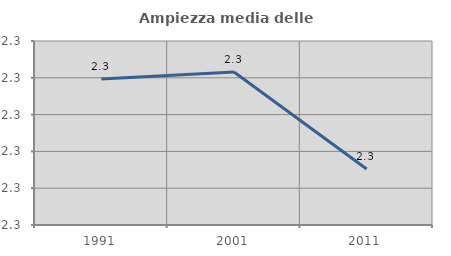
| Category | Ampiezza media delle famiglie |
|---|---|
| 1991.0 | 2.32 |
| 2001.0 | 2.322 |
| 2011.0 | 2.295 |